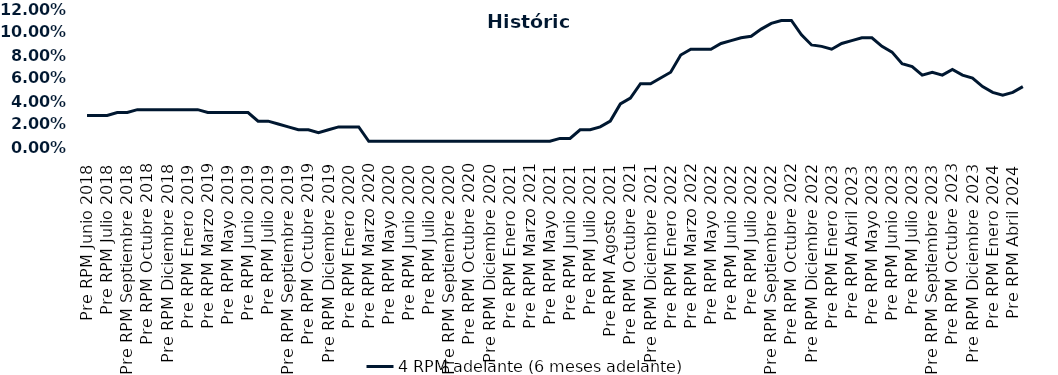
| Category | 4 RPM adelante (6 meses adelante) |
|---|---|
| Pre RPM Junio 2018 | 0.028 |
| Post RPM Junio 2018 | 0.028 |
| Pre RPM Julio 2018 | 0.028 |
| Post RPM Julio 2018 | 0.03 |
| Pre RPM Septiembre 2018 | 0.03 |
| Post RPM Septiembre 2018 | 0.032 |
| Pre RPM Octubre 2018 | 0.032 |
| Post RPM Octubre 2018 | 0.032 |
| Pre RPM Diciembre 2018 | 0.032 |
| Post RPM Diciembre 2018 | 0.032 |
| Pre RPM Enero 2019 | 0.032 |
| Post RPM Enero 2019 | 0.032 |
| Pre RPM Marzo 2019 | 0.03 |
| Post RPM Marzo 2019 | 0.03 |
| Pre RPM Mayo 2019 | 0.03 |
| Post RPM Mayo 2019 | 0.03 |
| Pre RPM Junio 2019 | 0.03 |
| Post RPM Junio 2019 | 0.022 |
| Pre RPM Julio 2019 | 0.022 |
| Post RPM Julio 2019 | 0.02 |
| Pre RPM Septiembre 2019 | 0.018 |
| Post RPM Septiembre 2019 | 0.015 |
| Pre RPM Octubre 2019 | 0.015 |
| Post RPM Octubre 2019 | 0.012 |
| Pre RPM Diciembre 2019 | 0.015 |
| Post RPM Diciembre 2019 | 0.018 |
| Pre RPM Enero 2020 | 0.018 |
| Post RPM Enero 2020 | 0.018 |
| Pre RPM Marzo 2020 | 0.005 |
| Post RPM Marzo 2020 | 0.005 |
| Pre RPM Mayo 2020 | 0.005 |
| Post RPM Mayo 2020 | 0.005 |
| Pre RPM Junio 2020 | 0.005 |
| Post RPM Junio 2020 | 0.005 |
| Pre RPM Julio 2020 | 0.005 |
| Post RPM Julio 2020 | 0.005 |
| Pre RPM Septiembre 2020 | 0.005 |
| Post RPM Septiembre 2020 | 0.005 |
| Pre RPM Octubre 2020 | 0.005 |
| Post RPM Octubre 2020 | 0.005 |
| Pre RPM Diciembre 2020 | 0.005 |
| Post RPM Diciembre 2020 | 0.005 |
| Pre RPM Enero 2021 | 0.005 |
| Post RPM Enero 2021 | 0.005 |
| Pre RPM Marzo 2021 | 0.005 |
| Post RPM Marzo 2021 | 0.005 |
| Pre RPM Mayo 2021 | 0.005 |
| Post RPM Mayo 2021 | 0.008 |
| Pre RPM Junio 2021 | 0.008 |
| Post RPM Junio 2021 | 0.015 |
| Pre RPM Julio 2021 | 0.015 |
| Post RPM Julio 2021 | 0.018 |
| Pre RPM Agosto 2021 | 0.022 |
| Post RPM Agosto 2021 | 0.038 |
| Pre RPM Octubre 2021 | 0.042 |
| Post RPM Octubre 2021 | 0.055 |
| Pre RPM Diciembre 2021 | 0.055 |
| Post RPM Diciembre 2021 | 0.06 |
| Pre RPM Enero 2022 | 0.065 |
| Post RPM Enero 2022 | 0.08 |
| Pre RPM Marzo 2022 | 0.085 |
| Post RPM Marzo 2022 | 0.085 |
| Pre RPM Mayo 2022 | 0.085 |
| Post RPM Mayo 2022 | 0.09 |
| Pre RPM Junio 2022 | 0.092 |
| Post RPM Junio 2022 | 0.095 |
| Pre RPM Julio 2022 | 0.096 |
| Post RPM Julio 2022 | 0.102 |
| Pre RPM Septiembre 2022 | 0.108 |
| Post RPM Septiembre 2022 | 0.11 |
| Pre RPM Octubre 2022 | 0.11 |
| Post RPM Octubre 2022 | 0.098 |
| Pre RPM Diciembre 2022 | 0.089 |
| Post RPM Diciembre 2022 | 0.088 |
| Pre RPM Enero 2023 | 0.085 |
| Post RPM Enero 2023 | 0.09 |
| Pre RPM Abril 2023 | 0.092 |
| Post RPM Abril 2023 | 0.095 |
| Pre RPM Mayo 2023 | 0.095 |
| Post RPM Mayo 2023 | 0.088 |
| Pre RPM Junio 2023 | 0.082 |
| Post RPM Junio 2023 | 0.072 |
| Pre RPM Julio 2023 | 0.07 |
| Post RPM Julio 2023 | 0.062 |
| Pre RPM Septiembre 2023 | 0.065 |
| Post RPM Septiembre 2023 | 0.062 |
| Pre RPM Octubre 2023 | 0.068 |
| Post RPM Octubre 2023 | 0.062 |
| Pre RPM Diciembre 2023 | 0.06 |
| Post RPM Diciembre 2023 | 0.052 |
| Pre RPM Enero 2024 | 0.048 |
| Post RPM Enero 2024 | 0.045 |
| Pre RPM Abril 2024 | 0.048 |
| Post RPM Abril 2024 | 0.052 |